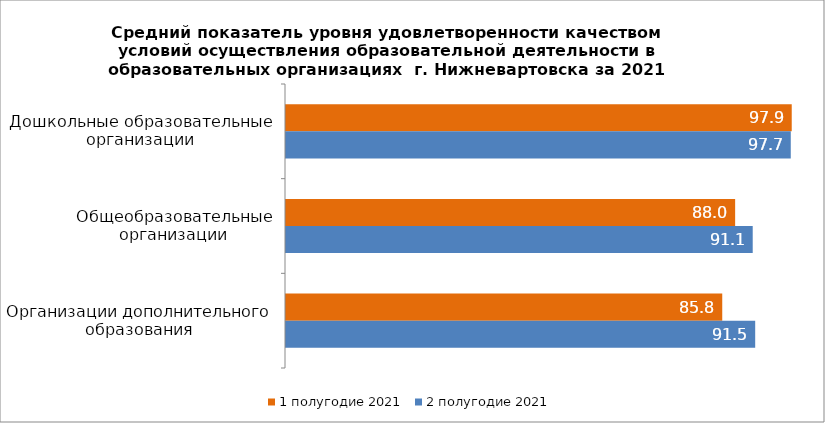
| Category | 1 полугодие 2021 | 2 полугодие 2021 |
|---|---|---|
| Дошкольные образовательные организации | 97.869 | 97.7 |
| Общеобразовательные организации | 88.036 | 91.09 |
| Организации дополнительного образования | 85.795 | 91.52 |